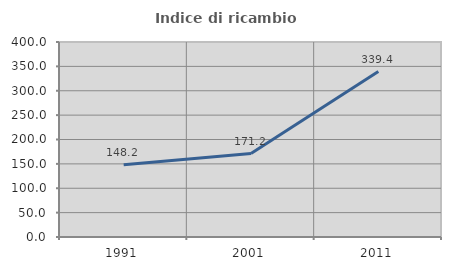
| Category | Indice di ricambio occupazionale  |
|---|---|
| 1991.0 | 148.214 |
| 2001.0 | 171.154 |
| 2011.0 | 339.394 |